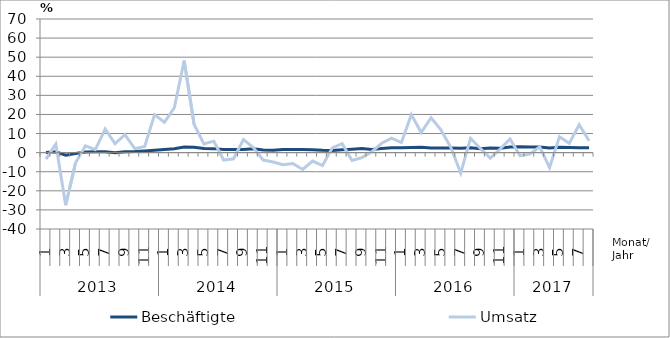
| Category | Beschäftigte | Umsatz |
|---|---|---|
| 0 | 0.1 | -3.4 |
| 1 | 0.4 | 4.5 |
| 2 | -1.3 | -27.5 |
| 3 | -0.4 | -5.3 |
| 4 | 0.3 | 3.6 |
| 5 | 0.4 | 1.6 |
| 6 | 0.4 | 12.4 |
| 7 | 0 | 4.7 |
| 8 | 0.5 | 9.4 |
| 9 | 0.6 | 2.1 |
| 10 | 0.9 | 3.2 |
| 11 | 1.2 | 19.9 |
| 12 | 1.6 | 15.9 |
| 13 | 2 | 23.5 |
| 14 | 2.9 | 48.2 |
| 15 | 2.8 | 14.9 |
| 16 | 2.2 | 4.5 |
| 17 | 2.1 | 6 |
| 18 | 1.6 | -3.9 |
| 19 | 1.6 | -3.2 |
| 20 | 1.6 | 6.8 |
| 21 | 2 | 2.7 |
| 22 | 1.4 | -3.9 |
| 23 | 1.3 | -4.9 |
| 24 | 1.7 | -6.3 |
| 25 | 1.7 | -5.7 |
| 26 | 1.7 | -8.8 |
| 27 | 1.5 | -4.4 |
| 28 | 1.2 | -6.8 |
| 29 | 1.1 | 2.5 |
| 30 | 1.5 | 4.7 |
| 31 | 1.8 | -4.1 |
| 32 | 2.1 | -2.6 |
| 33 | 1.6 | 0.5 |
| 34 | 2.2 | 4.9 |
| 35 | 2.6 | 7.6 |
| 36 | 2.5 | 5.3 |
| 37 | 2.7 | 19.9 |
| 38 | 2.8 | 10.5 |
| 39 | 2.4 | 18.3 |
| 40 | 2.4 | 11.9 |
| 41 | 2.4 | 2.8 |
| 42 | 2.3 | -10.7 |
| 43 | 2.5 | 7.5 |
| 44 | 2 | 2.2 |
| 45 | 2.4 | -2.9 |
| 46 | 2.3 | 1.9 |
| 47 | 2.9 | 7.2 |
| 48 | 3.1 | -1.6 |
| 49 | 3 | -0.8 |
| 50 | 3 | 3.1 |
| 51 | 2.4 | -7.9 |
| 52 | 2.8 | 8.3 |
| 53 | 2.7 | 4.9 |
| 54 | 2.6 | 14.6 |
| 55 | 2.5 | 6.2 |